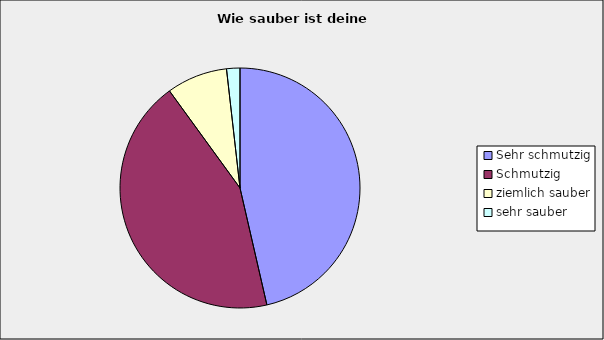
| Category | Series 0 |
|---|---|
| Sehr schmutzig | 0.464 |
| Schmutzig | 0.436 |
| ziemlich sauber | 0.082 |
| sehr sauber | 0.018 |